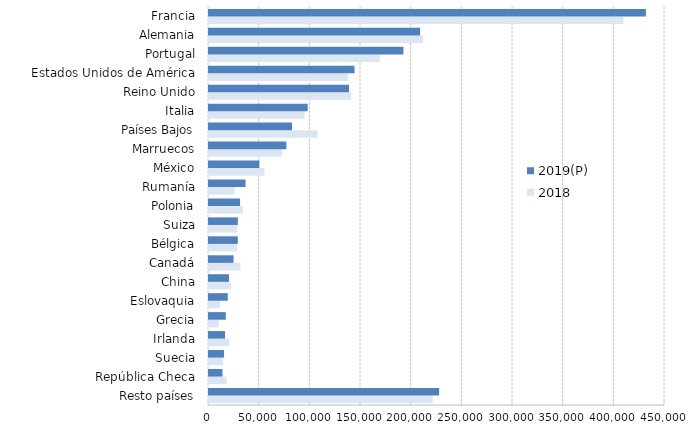
| Category | 2018 | 2019(P) |
|---|---|---|
| Resto países | 220865.329 | 227133.228 |
| República Checa | 17454.362 | 13322.777 |
| Suecia | 14024.435 | 14877.707 |
| Irlanda | 20051.547 | 15889.057 |
| Grecia | 9519.587 | 16567.246 |
| Eslovaquia | 11074.216 | 18539.071 |
| China | 21648.022 | 19751.488 |
| Canadá | 30984.79 | 24183.181 |
| Bélgica | 27778.443 | 28406.445 |
| Suiza | 28049.639 | 28443.07 |
| Polonia | 33447.881 | 30677.072 |
| Rumanía | 25496.18 | 36049.584 |
| México | 54700.965 | 49682.155 |
| Marruecos | 72097.632 | 76317.371 |
| Países Bajos | 106944.944 | 81911.143 |
| Italia | 94479.814 | 97370.107 |
| Reino Unido | 140209.789 | 138191.222 |
| Estados Unidos de América | 137392.012 | 143607.091 |
| Portugal | 168778.795 | 191880.455 |
| Alemania | 211237.642 | 208354.847 |
| Francia | 409011.693 | 431124.522 |